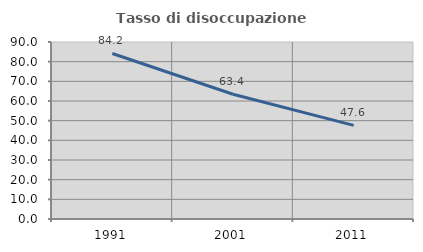
| Category | Tasso di disoccupazione giovanile  |
|---|---|
| 1991.0 | 84.155 |
| 2001.0 | 63.422 |
| 2011.0 | 47.603 |